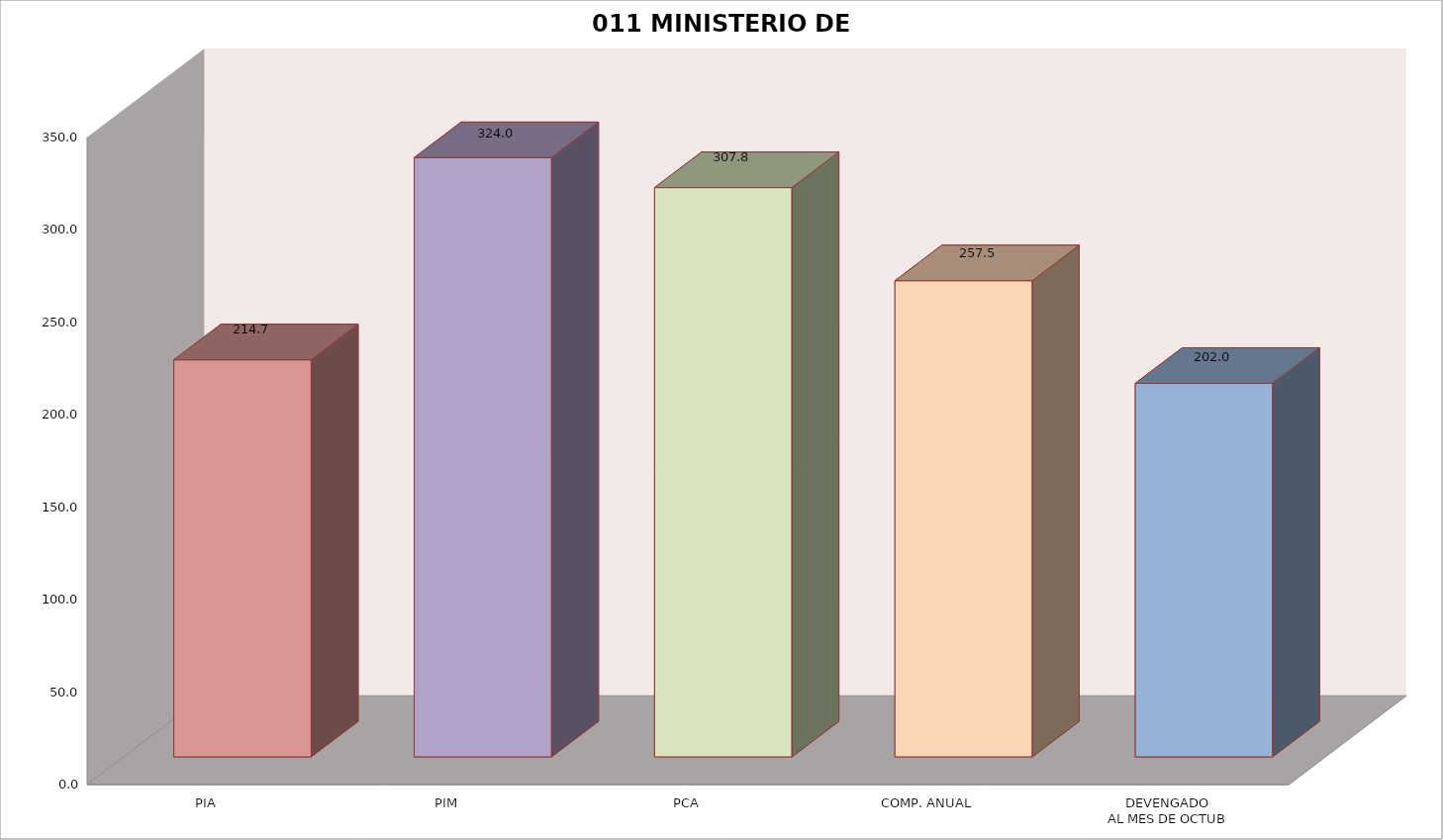
| Category | 011 MINISTERIO DE SALUD |
|---|---|
| PIA | 214.675 |
| PIM | 324.032 |
| PCA | 307.83 |
| COMP. ANUAL | 257.458 |
| DEVENGADO
AL MES DE OCTUB | 201.977 |